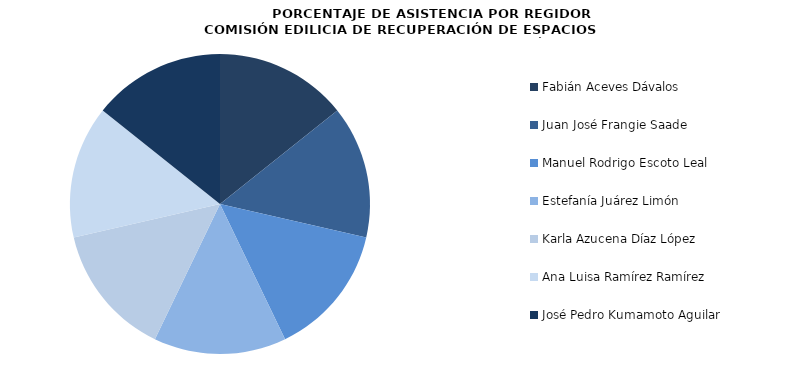
| Category | Series 0 |
|---|---|
| Fabián Aceves Dávalos | 100 |
| Juan José Frangie Saade | 100 |
| Manuel Rodrigo Escoto Leal | 100 |
| Estefanía Juárez Limón | 100 |
| Karla Azucena Díaz López | 100 |
| Ana Luisa Ramírez Ramírez | 100 |
| José Pedro Kumamoto Aguilar | 100 |